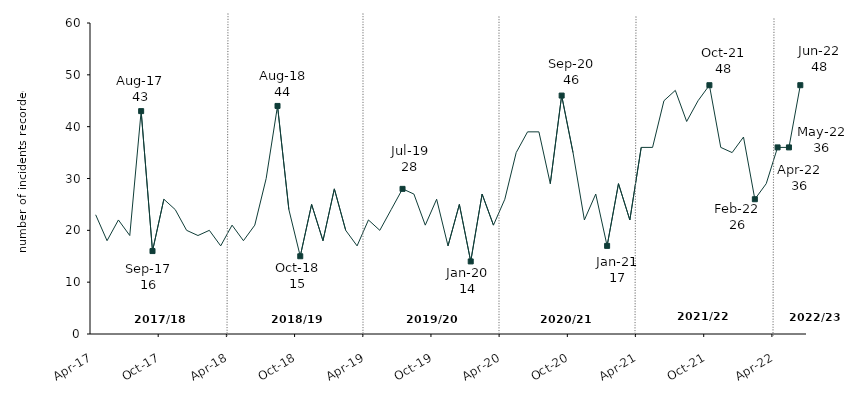
| Category | Series 0 |
|---|---|
| 2017-04-01 | 23 |
| 2017-05-01 | 18 |
| 2017-06-01 | 22 |
| 2017-07-01 | 19 |
| 2017-08-01 | 43 |
| 2017-09-01 | 16 |
| 2017-10-01 | 26 |
| 2017-11-01 | 24 |
| 2017-12-01 | 20 |
| 2018-01-01 | 19 |
| 2018-02-01 | 20 |
| 2018-03-01 | 17 |
| 2018-04-01 | 21 |
| 2018-05-01 | 18 |
| 2018-06-01 | 21 |
| 2018-07-01 | 30 |
| 2018-08-01 | 44 |
| 2018-09-01 | 24 |
| 2018-10-01 | 15 |
| 2018-11-01 | 25 |
| 2018-12-01 | 18 |
| 2019-01-01 | 28 |
| 2019-02-01 | 20 |
| 2019-03-01 | 17 |
| 2019-04-01 | 22 |
| 2019-05-01 | 20 |
| 2019-06-01 | 24 |
| 2019-07-01 | 28 |
| 2019-08-01 | 27 |
| 2019-09-01 | 21 |
| 2019-10-01 | 26 |
| 2019-11-01 | 17 |
| 2019-12-01 | 25 |
| 2020-01-01 | 14 |
| 2020-02-01 | 27 |
| 2020-03-01 | 21 |
| 2020-04-01 | 26 |
| 2020-05-01 | 35 |
| 2020-06-01 | 39 |
| 2020-07-01 | 39 |
| 2020-08-01 | 29 |
| 2020-09-01 | 46 |
| 2020-10-01 | 35 |
| 2020-11-01 | 22 |
| 2020-12-01 | 27 |
| 2021-01-01 | 17 |
| 2021-02-01 | 29 |
| 2021-03-01 | 22 |
| 2021-04-01 | 36 |
| 2021-05-01 | 36 |
| 2021-06-01 | 45 |
| 2021-07-01 | 47 |
| 2021-08-01 | 41 |
| 2021-09-01 | 45 |
| 2021-10-01 | 48 |
| 2021-11-01 | 36 |
| 2021-12-01 | 35 |
| 2022-01-01 | 38 |
| 2022-02-01 | 26 |
| 2022-03-01 | 29 |
| 2022-04-01 | 36 |
| 2022-05-01 | 36 |
| 2022-06-01 | 48 |